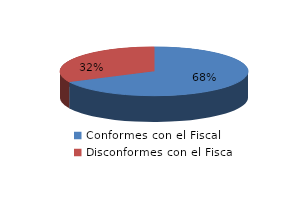
| Category | Series 0 |
|---|---|
| 0 | 21 |
| 1 | 10 |